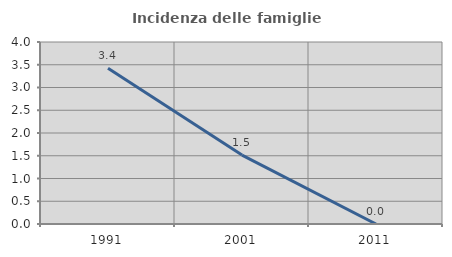
| Category | Incidenza delle famiglie numerose |
|---|---|
| 1991.0 | 3.425 |
| 2001.0 | 1.515 |
| 2011.0 | 0 |